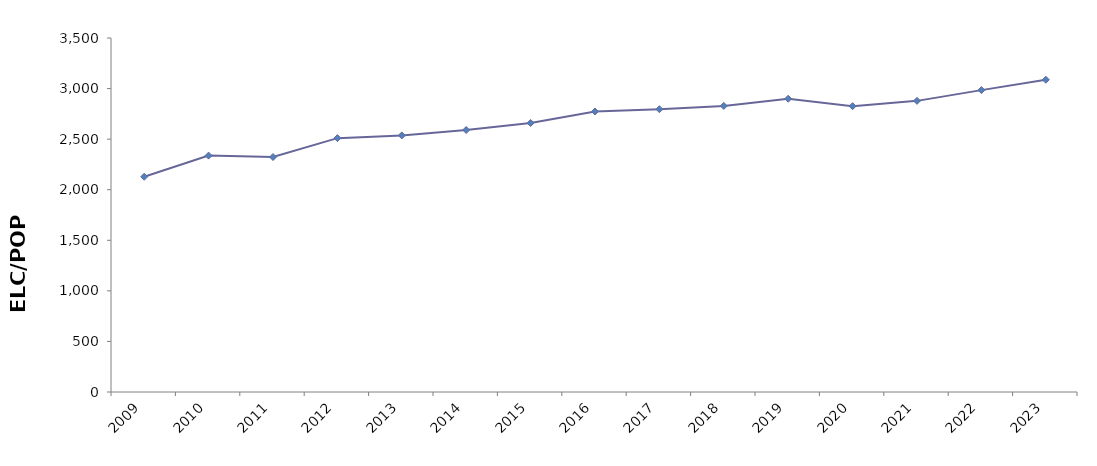
| Category | Electricity per Capita (KWh/Person) |
|---|---|
| 2009 | 2127.991 |
| 2010 | 2337.248 |
| 2011 | 2323.148 |
| 2012 | 2509.884 |
| 2013 | 2536.65 |
| 2014 | 2590.361 |
| 2015 | 2659.884 |
| 2016 | 2773.184 |
| 2017 | 2796.039 |
| 2018 | 2828.171 |
| 2019 | 2899.092 |
| 2020 | 2826.053 |
| 2021 | 2878.419 |
| 2022 | 2984.643 |
| 2023 | 3087.279 |